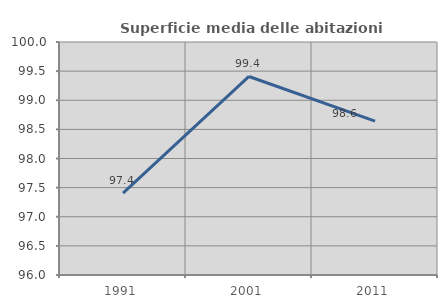
| Category | Superficie media delle abitazioni occupate |
|---|---|
| 1991.0 | 97.406 |
| 2001.0 | 99.408 |
| 2011.0 | 98.64 |